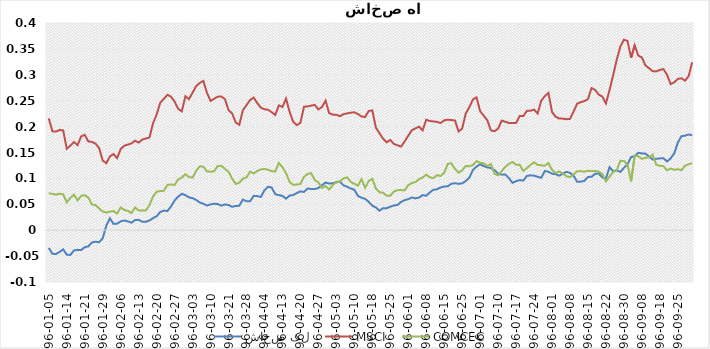
| Category | شاخص کل | MSCI | COMCEC |
|---|---|---|---|
| 1396-01-05 | -0.034 | 0.216 | 0.071 |
| 1396-01-06 | -0.046 | 0.191 | 0.07 |
| 1396-01-07 | -0.046 | 0.19 | 0.069 |
| 1396-01-08 | -0.042 | 0.193 | 0.07 |
| 1396-01-09 | -0.037 | 0.193 | 0.069 |
| 1396-01-14 | -0.047 | 0.157 | 0.054 |
| 1396-01-15 | -0.048 | 0.163 | 0.062 |
| 1396-01-16 | -0.039 | 0.17 | 0.069 |
| 1396-01-19 | -0.038 | 0.164 | 0.058 |
| 1396-01-20 | -0.038 | 0.181 | 0.066 |
| 1396-01-21 | -0.033 | 0.184 | 0.067 |
| 1396-01-23 | -0.031 | 0.171 | 0.063 |
| 1396-01-26 | -0.024 | 0.17 | 0.05 |
| 1396-01-27 | -0.022 | 0.167 | 0.048 |
| 1396-01-28 | -0.023 | 0.159 | 0.042 |
| 1396-01-29 | -0.016 | 0.135 | 0.036 |
| 1396-01-30 | 0.009 | 0.129 | 0.034 |
| 1396-02-02 | 0.023 | 0.142 | 0.036 |
| 1396-02-03 | 0.012 | 0.147 | 0.037 |
| 1396-02-04 | 0.013 | 0.139 | 0.032 |
| 1396-02-06 | 0.017 | 0.157 | 0.044 |
| 1396-02-09 | 0.019 | 0.163 | 0.039 |
| 1396-02-10 | 0.017 | 0.165 | 0.037 |
| 1396-02-11 | 0.014 | 0.167 | 0.033 |
| 1396-02-12 | 0.02 | 0.173 | 0.044 |
| 1396-02-13 | 0.02 | 0.169 | 0.038 |
| 1396-02-16 | 0.016 | 0.175 | 0.038 |
| 1396-02-17 | 0.016 | 0.177 | 0.038 |
| 1396-02-18 | 0.019 | 0.179 | 0.048 |
| 1396-02-19 | 0.023 | 0.206 | 0.065 |
| 1396-02-20 | 0.027 | 0.223 | 0.074 |
| 1396-02-23 | 0.035 | 0.246 | 0.076 |
| 1396-02-24 | 0.038 | 0.254 | 0.076 |
| 1396-02-25 | 0.037 | 0.261 | 0.087 |
| 1396-02-26 | 0.046 | 0.258 | 0.088 |
| 1396-02-27 | 0.057 | 0.248 | 0.087 |
| 1396-02-30 | 0.065 | 0.234 | 0.098 |
| 1396-02-31 | 0.07 | 0.229 | 0.102 |
| 1396-03-01 | 0.068 | 0.259 | 0.108 |
| 1396-03-02 | 0.063 | 0.253 | 0.103 |
| 1396-03-03 | 0.062 | 0.265 | 0.102 |
| 1396-03-06 | 0.059 | 0.278 | 0.115 |
| 1396-03-07 | 0.054 | 0.284 | 0.124 |
| 1396-03-08 | 0.051 | 0.288 | 0.123 |
| 1396-03-09 | 0.048 | 0.265 | 0.114 |
| 1396-03-10 | 0.05 | 0.25 | 0.113 |
| 1396-03-13 | 0.051 | 0.254 | 0.114 |
| 1396-03-16 | 0.051 | 0.258 | 0.124 |
| 1396-03-17 | 0.047 | 0.258 | 0.124 |
| 1396-03-20 | 0.05 | 0.253 | 0.119 |
| 1396-03-21 | 0.049 | 0.232 | 0.113 |
| 1396-03-22 | 0.045 | 0.226 | 0.1 |
| 1396-03-23 | 0.047 | 0.208 | 0.089 |
| 1396-03-24 | 0.047 | 0.203 | 0.092 |
| 1396-03-27 | 0.059 | 0.232 | 0.099 |
| 1396-03-28 | 0.056 | 0.241 | 0.102 |
| 1396-03-29 | 0.056 | 0.251 | 0.113 |
| 1396-03-30 | 0.066 | 0.256 | 0.11 |
| 1396-03-31 | 0.066 | 0.245 | 0.114 |
| 1396-04-03 | 0.064 | 0.236 | 0.117 |
| 1396-04-04 | 0.077 | 0.233 | 0.118 |
| 1396-04-07 | 0.084 | 0.233 | 0.117 |
| 1396-04-10 | 0.082 | 0.228 | 0.114 |
| 1396-04-11 | 0.07 | 0.222 | 0.113 |
| 1396-04-12 | 0.068 | 0.241 | 0.13 |
| 1396-04-13 | 0.066 | 0.238 | 0.121 |
| 1396-04-14 | 0.061 | 0.254 | 0.11 |
| 1396-04-17 | 0.067 | 0.228 | 0.093 |
| 1396-04-18 | 0.068 | 0.209 | 0.087 |
| 1396-04-19 | 0.072 | 0.203 | 0.088 |
| 1396-04-20 | 0.075 | 0.207 | 0.089 |
| 1396-04-21 | 0.074 | 0.238 | 0.103 |
| 1396-04-24 | 0.081 | 0.239 | 0.108 |
| 1396-04-25 | 0.079 | 0.24 | 0.11 |
| 1396-04-26 | 0.08 | 0.242 | 0.097 |
| 1396-04-27 | 0.081 | 0.233 | 0.092 |
| 1396-04-28 | 0.087 | 0.238 | 0.082 |
| 1396-04-31 | 0.092 | 0.25 | 0.085 |
| 1396-05-01 | 0.09 | 0.226 | 0.079 |
| 1396-05-02 | 0.091 | 0.223 | 0.087 |
| 1396-05-03 | 0.092 | 0.223 | 0.093 |
| 1396-05-04 | 0.094 | 0.22 | 0.094 |
| 1396-05-07 | 0.087 | 0.224 | 0.1 |
| 1396-05-08 | 0.084 | 0.225 | 0.102 |
| 1396-05-09 | 0.08 | 0.227 | 0.093 |
| 1396-05-10 | 0.078 | 0.228 | 0.09 |
| 1396-05-11 | 0.066 | 0.224 | 0.086 |
| 1396-05-15 | 0.063 | 0.22 | 0.099 |
| 1396-05-16 | 0.061 | 0.218 | 0.082 |
| 1396-05-17 | 0.055 | 0.23 | 0.095 |
| 1396-05-18 | 0.047 | 0.231 | 0.1 |
| 1396-05-21 | 0.044 | 0.198 | 0.08 |
| 1396-05-22 | 0.038 | 0.187 | 0.074 |
| 1396-05-23 | 0.043 | 0.177 | 0.072 |
| 1396-05-24 | 0.042 | 0.17 | 0.067 |
| 1396-05-25 | 0.045 | 0.174 | 0.067 |
| 1396-05-28 | 0.048 | 0.166 | 0.075 |
| 1396-05-29 | 0.049 | 0.164 | 0.077 |
| 1396-05-30 | 0.055 | 0.161 | 0.077 |
| 1396-05-31 | 0.058 | 0.171 | 0.077 |
| 1396-06-01 | 0.06 | 0.182 | 0.087 |
| 1396-06-04 | 0.063 | 0.193 | 0.091 |
| 1396-06-05 | 0.061 | 0.196 | 0.093 |
| 1396-06-06 | 0.063 | 0.2 | 0.099 |
| 1396-06-07 | 0.068 | 0.193 | 0.102 |
| 1396-06-08 | 0.066 | 0.213 | 0.107 |
| 1396-06-11 | 0.073 | 0.211 | 0.102 |
| 1396-06-12 | 0.078 | 0.21 | 0.1 |
| 1396-06-13 | 0.079 | 0.209 | 0.106 |
| 1396-06-14 | 0.082 | 0.207 | 0.105 |
| 1396-06-15 | 0.084 | 0.212 | 0.111 |
| 1396-06-19 | 0.085 | 0.213 | 0.128 |
| 1396-06-20 | 0.09 | 0.213 | 0.129 |
| 1396-06-21 | 0.091 | 0.212 | 0.118 |
| 1396-06-22 | 0.089 | 0.191 | 0.111 |
| 1396-06-25 | 0.09 | 0.196 | 0.115 |
| 1396-06-26 | 0.095 | 0.225 | 0.124 |
| 1396-06-27 | 0.101 | 0.237 | 0.123 |
| 1396-06-28 | 0.116 | 0.252 | 0.126 |
| 1396-06-29 | 0.123 | 0.256 | 0.133 |
| 1396-07-01 | 0.127 | 0.23 | 0.13 |
| 1396-07-02 | 0.124 | 0.221 | 0.129 |
| 1396-07-03 | 0.121 | 0.212 | 0.124 |
| 1396-07-04 | 0.12 | 0.193 | 0.128 |
| 1396-07-05 | 0.116 | 0.191 | 0.109 |
| 1396-07-10 | 0.109 | 0.196 | 0.106 |
| 1396-07-11 | 0.107 | 0.212 | 0.114 |
| 1396-07-12 | 0.107 | 0.209 | 0.122 |
| 1396-07-15 | 0.101 | 0.207 | 0.128 |
| 1396-07-16 | 0.091 | 0.207 | 0.132 |
| 1396-07-17 | 0.095 | 0.207 | 0.127 |
| 1396-07-18 | 0.097 | 0.22 | 0.126 |
| 1396-07-19 | 0.096 | 0.22 | 0.114 |
| 1396-07-22 | 0.105 | 0.23 | 0.12 |
| 1396-07-23 | 0.106 | 0.231 | 0.126 |
| 1396-07-24 | 0.105 | 0.233 | 0.131 |
| 1396-07-25 | 0.103 | 0.225 | 0.126 |
| 1396-07-26 | 0.101 | 0.25 | 0.125 |
| 1396-07-29 | 0.114 | 0.259 | 0.124 |
| 1396-07-30 | 0.113 | 0.265 | 0.129 |
| 1396-08-01 | 0.109 | 0.228 | 0.117 |
| 1396-08-02 | 0.108 | 0.219 | 0.11 |
| 1396-08-03 | 0.105 | 0.216 | 0.113 |
| 1396-08-06 | 0.109 | 0.215 | 0.109 |
| 1396-08-07 | 0.113 | 0.214 | 0.104 |
| 1396-08-08 | 0.111 | 0.215 | 0.102 |
| 1396-08-09 | 0.105 | 0.229 | 0.108 |
| 1396-08-10 | 0.093 | 0.244 | 0.114 |
| 1396-08-13 | 0.094 | 0.247 | 0.114 |
| 1396-08-14 | 0.095 | 0.249 | 0.113 |
| 1396-08-15 | 0.103 | 0.253 | 0.115 |
| 1396-08-16 | 0.103 | 0.274 | 0.114 |
| 1396-08-17 | 0.109 | 0.271 | 0.114 |
| 1396-08-20 | 0.109 | 0.262 | 0.113 |
| 1396-08-21 | 0.102 | 0.258 | 0.109 |
| 1396-08-22 | 0.1 | 0.245 | 0.094 |
| 1396-08-23 | 0.122 | 0.271 | 0.103 |
| 1396-08-24 | 0.114 | 0.299 | 0.113 |
| 1396-08-27 | 0.116 | 0.329 | 0.116 |
| 1396-08-29 | 0.112 | 0.354 | 0.134 |
| 1396-08-30 | 0.12 | 0.368 | 0.134 |
| 1396-09-01 | 0.127 | 0.365 | 0.127 |
| 1396-09-04 | 0.141 | 0.333 | 0.094 |
| 1396-09-05 | 0.143 | 0.357 | 0.144 |
| 1396-09-07 | 0.149 | 0.337 | 0.143 |
| 1396-09-08 | 0.148 | 0.334 | 0.138 |
| 1396-09-11 | 0.148 | 0.318 | 0.14 |
| 1396-09-12 | 0.142 | 0.313 | 0.141 |
| 1396-09-13 | 0.136 | 0.307 | 0.146 |
| 1396-09-14 | 0.138 | 0.307 | 0.126 |
| 1396-09-18 | 0.139 | 0.309 | 0.124 |
| 1396-09-19 | 0.139 | 0.311 | 0.124 |
| 1396-09-20 | 0.133 | 0.3 | 0.116 |
| 1396-09-21 | 0.139 | 0.282 | 0.119 |
| 1396-09-22 | 0.148 | 0.285 | 0.117 |
| 1396-09-25 | 0.169 | 0.292 | 0.118 |
| 1396-09-26 | 0.181 | 0.293 | 0.116 |
| 1396-09-27 | 0.183 | 0.289 | 0.124 |
| 1396-09-28 | 0.185 | 0.297 | 0.128 |
| 1396-09-29 | 0.183 | 0.324 | 0.129 |